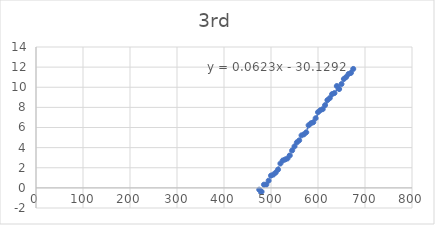
| Category | Series 0 |
|---|---|
| 475.0 | -0.18 |
| 480.0 | -0.38 |
| 485.0 | 0.32 |
| 490.0 | 0.32 |
| 495.0 | 0.72 |
| 500.0 | 1.22 |
| 505.0 | 1.32 |
| 510.0 | 1.52 |
| 515.0 | 1.82 |
| 520.0 | 2.42 |
| 525.0 | 2.72 |
| 530.0 | 2.82 |
| 535.0 | 2.92 |
| 540.0 | 3.22 |
| 545.0 | 3.72 |
| 550.0 | 4.12 |
| 555.0 | 4.52 |
| 560.0 | 4.72 |
| 565.0 | 5.22 |
| 570.0 | 5.32 |
| 575.0 | 5.52 |
| 580.0 | 6.22 |
| 585.0 | 6.42 |
| 590.0 | 6.52 |
| 595.0 | 6.92 |
| 600.0 | 7.52 |
| 605.0 | 7.72 |
| 610.0 | 7.82 |
| 615.0 | 8.22 |
| 620.0 | 8.72 |
| 625.0 | 8.92 |
| 630.0 | 9.32 |
| 635.0 | 9.42 |
| 640.0 | 10.12 |
| 645.0 | 9.82 |
| 650.0 | 10.32 |
| 655.0 | 10.82 |
| 660.0 | 11.02 |
| 665.0 | 11.32 |
| 670.0 | 11.42 |
| 675.0 | 11.82 |